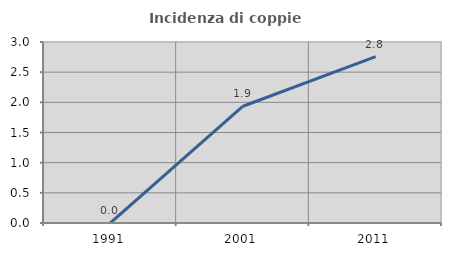
| Category | Incidenza di coppie miste |
|---|---|
| 1991.0 | 0 |
| 2001.0 | 1.935 |
| 2011.0 | 2.759 |